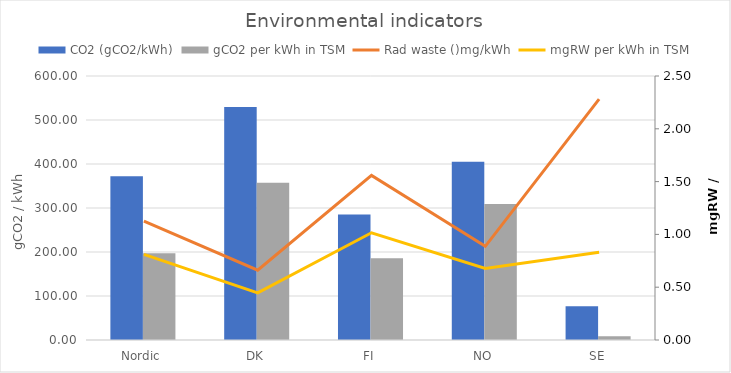
| Category | CO2 (gCO2/kWh) | gCO2 per kWh in TSM |
|---|---|---|
| Nordic | 371.999 | 196.916 |
| DK | 529.321 | 357.49 |
| FI | 285.319 | 185.853 |
| NO | 404.908 | 309.256 |
| SE | 76.628 | 8.264 |